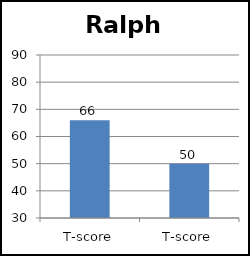
| Category | Ralph |
|---|---|
| T-score | 66 |
| T-score | 50 |